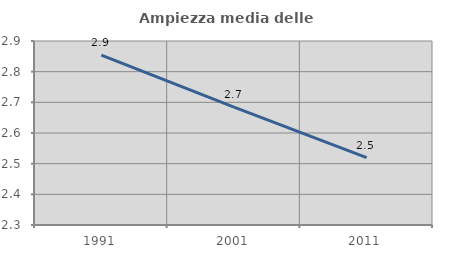
| Category | Ampiezza media delle famiglie |
|---|---|
| 1991.0 | 2.854 |
| 2001.0 | 2.685 |
| 2011.0 | 2.519 |